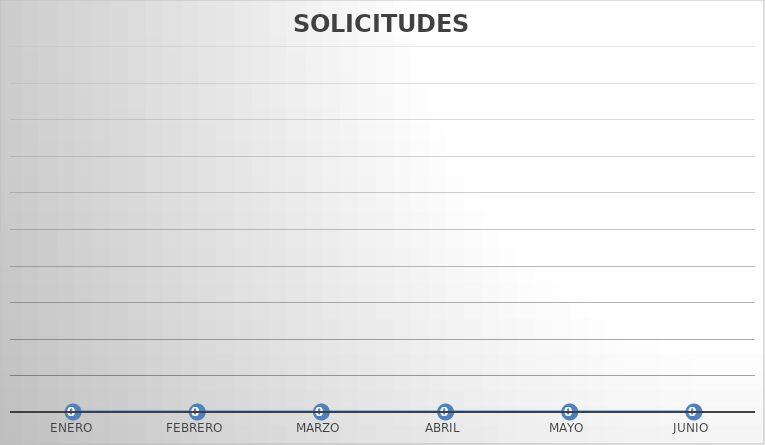
| Category | SOLICITUDES NEGADAS |
|---|---|
| ENERO | 0 |
| FEBRERO | 0 |
| MARZO | 0 |
| ABRIL | 0 |
| MAYO | 0 |
| JUNIO | 0 |